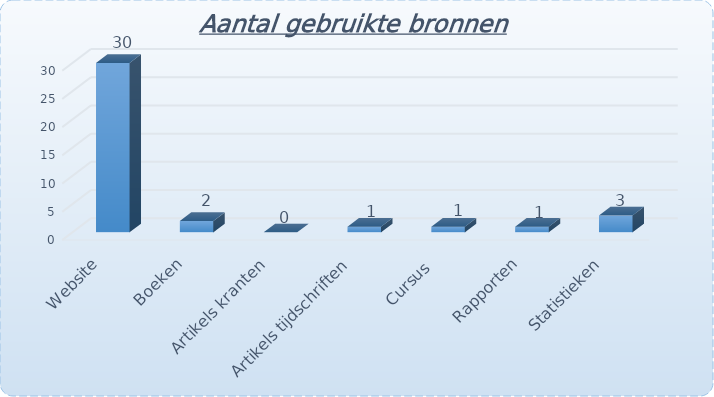
| Category | Aantal |
|---|---|
| Website | 30 |
| Boeken | 2 |
| Artikels kranten | 0 |
| Artikels tijdschriften | 1 |
| Cursus  | 1 |
| Rapporten | 1 |
| Statistieken | 3 |